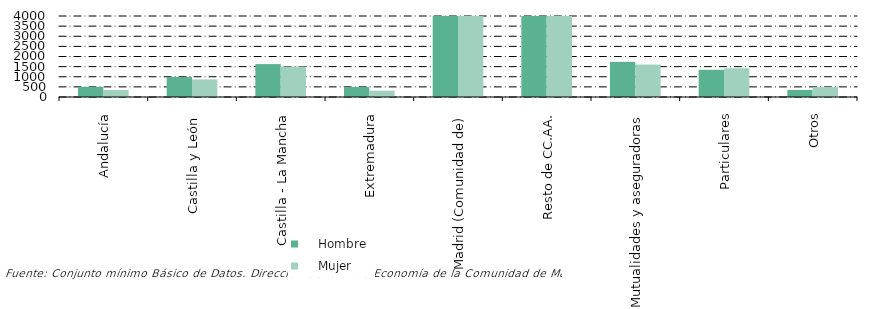
| Category |     Hombre |     Mujer |
|---|---|---|
| Andalucía | 494 | 344 |
| Castilla y León  | 990 | 869 |
| Castilla - La Mancha | 1626 | 1508 |
| Extremadura | 491 | 312 |
| Madrid (Comunidad de) | 355343 | 442786 |
| Resto de CC.AA. | 182441 | 215956 |
| Mutualidades y aseguradoras | 1735 | 1603 |
| Particulares | 1344 | 1419 |
| Otros | 348 | 489 |